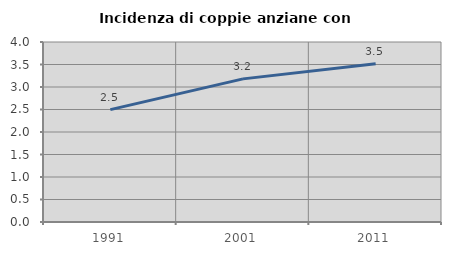
| Category | Incidenza di coppie anziane con figli |
|---|---|
| 1991.0 | 2.497 |
| 2001.0 | 3.181 |
| 2011.0 | 3.516 |